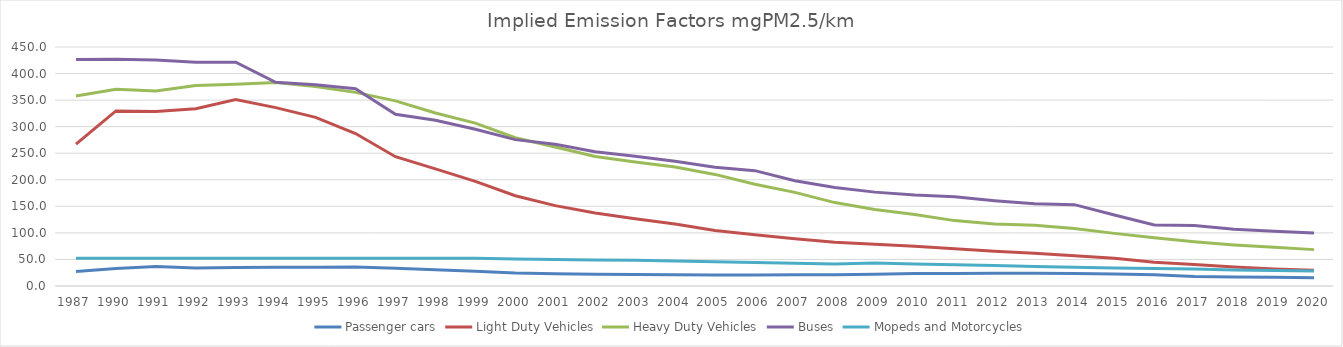
| Category | Passenger cars | Light Duty Vehicles | Heavy Duty Vehicles | Buses | Mopeds and Motorcycles |
|---|---|---|---|---|---|
| 1987.0 | 27.178 | 267.006 | 357.771 | 426.463 | 52.308 |
| 1990.0 | 33.038 | 329.616 | 370.593 | 426.881 | 52.309 |
| 1991.0 | 36.548 | 328.372 | 367.316 | 425.337 | 52.314 |
| 1992.0 | 33.667 | 333.911 | 377.454 | 421.339 | 52.304 |
| 1993.0 | 34.944 | 351.127 | 379.795 | 421.293 | 52.304 |
| 1994.0 | 35.348 | 335.818 | 382.969 | 383.474 | 52.309 |
| 1995.0 | 35.531 | 317.478 | 375.38 | 378.932 | 52.311 |
| 1996.0 | 35.545 | 287.047 | 364.553 | 371.275 | 52.309 |
| 1997.0 | 33.623 | 243.428 | 348.622 | 323.321 | 52.307 |
| 1998.0 | 30.564 | 220.413 | 325.804 | 312.199 | 52.307 |
| 1999.0 | 27.942 | 196.893 | 306.734 | 295.157 | 52.307 |
| 2000.0 | 24.306 | 169.882 | 279.248 | 275.605 | 50.809 |
| 2001.0 | 23.157 | 151.324 | 261.741 | 266.764 | 49.771 |
| 2002.0 | 22.225 | 137.386 | 243.849 | 252.834 | 49.02 |
| 2003.0 | 21.71 | 126.676 | 233.47 | 244.367 | 48.574 |
| 2004.0 | 21.229 | 116.864 | 224.053 | 235.005 | 47.305 |
| 2005.0 | 20.519 | 104.582 | 210.102 | 223.712 | 45.714 |
| 2006.0 | 20.837 | 96.348 | 191.465 | 217.167 | 44.151 |
| 2007.0 | 21.218 | 89.117 | 176.343 | 198.074 | 42.984 |
| 2008.0 | 21.262 | 82.201 | 157.057 | 185.43 | 41.626 |
| 2009.0 | 22.2 | 78.708 | 144.103 | 176.751 | 43.311 |
| 2010.0 | 23.413 | 74.903 | 134.772 | 171.201 | 41.567 |
| 2011.0 | 23.564 | 70.308 | 123.117 | 167.916 | 39.865 |
| 2012.0 | 23.782 | 65.219 | 116.887 | 160.513 | 38.64 |
| 2013.0 | 24.022 | 61.64 | 114.421 | 154.65 | 36.676 |
| 2014.0 | 23.654 | 57.15 | 108.295 | 153.19 | 35.359 |
| 2015.0 | 22.707 | 52.206 | 99.067 | 133.724 | 33.945 |
| 2016.0 | 21.311 | 44.903 | 90.674 | 115.047 | 32.719 |
| 2017.0 | 17.958 | 40.441 | 83.535 | 114.123 | 32.107 |
| 2018.0 | 17.133 | 35.666 | 77.413 | 106.857 | 30.205 |
| 2019.0 | 16.257 | 32.232 | 72.762 | 102.899 | 29.253 |
| 2020.0 | 15.733 | 29.699 | 68.489 | 99.973 | 28.256 |